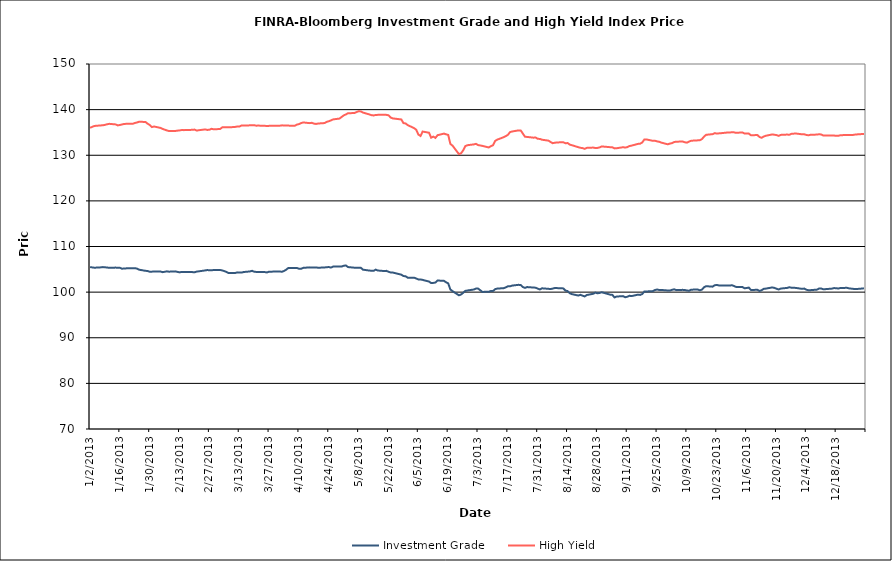
| Category | Investment Grade | High Yield |
|---|---|---|
| 1/2/13 | 105.494 | 136.004 |
| 1/3/13 | 105.419 | 136.223 |
| 1/4/13 | 105.349 | 136.418 |
| 1/7/13 | 105.428 | 136.539 |
| 1/8/13 | 105.485 | 136.567 |
| 1/9/13 | 105.45 | 136.666 |
| 1/10/13 | 105.382 | 136.791 |
| 1/11/13 | 105.347 | 136.887 |
| 1/14/13 | 105.372 | 136.76 |
| 1/15/13 | 105.348 | 136.538 |
| 1/16/13 | 105.332 | 136.64 |
| 1/17/13 | 105.127 | 136.744 |
| 1/18/13 | 105.195 | 136.872 |
| 1/22/13 | 105.239 | 136.901 |
| 1/23/13 | 105.259 | 137.065 |
| 1/24/13 | 105.154 | 137.18 |
| 1/25/13 | 104.918 | 137.344 |
| 1/28/13 | 104.671 | 137.292 |
| 1/29/13 | 104.628 | 136.915 |
| 1/30/13 | 104.462 | 136.633 |
| 1/31/13 | 104.489 | 136.183 |
| 2/1/13 | 104.509 | 136.3 |
| 2/4/13 | 104.516 | 135.996 |
| 2/5/13 | 104.38 | 135.778 |
| 2/6/13 | 104.452 | 135.607 |
| 2/7/13 | 104.557 | 135.447 |
| 2/8/13 | 104.482 | 135.313 |
| 2/11/13 | 104.548 | 135.322 |
| 2/12/13 | 104.435 | 135.393 |
| 2/13/13 | 104.331 | 135.446 |
| 2/14/13 | 104.432 | 135.524 |
| 2/15/13 | 104.394 | 135.504 |
| 2/19/13 | 104.387 | 135.572 |
| 2/20/13 | 104.348 | 135.627 |
| 2/21/13 | 104.499 | 135.402 |
| 2/22/13 | 104.557 | 135.485 |
| 2/25/13 | 104.756 | 135.664 |
| 2/26/13 | 104.841 | 135.55 |
| 2/27/13 | 104.778 | 135.597 |
| 2/28/13 | 104.777 | 135.799 |
| 3/1/13 | 104.858 | 135.684 |
| 3/4/13 | 104.85 | 135.753 |
| 3/5/13 | 104.754 | 136.111 |
| 3/6/13 | 104.599 | 136.122 |
| 3/7/13 | 104.412 | 136.133 |
| 3/8/13 | 104.18 | 136.117 |
| 3/11/13 | 104.184 | 136.2 |
| 3/12/13 | 104.331 | 136.304 |
| 3/13/13 | 104.278 | 136.283 |
| 3/14/13 | 104.276 | 136.504 |
| 3/15/13 | 104.401 | 136.543 |
| 3/18/13 | 104.535 | 136.549 |
| 3/19/13 | 104.67 | 136.561 |
| 3/20/13 | 104.466 | 136.574 |
| 3/21/13 | 104.428 | 136.487 |
| 3/22/13 | 104.404 | 136.502 |
| 3/25/13 | 104.386 | 136.448 |
| 3/26/13 | 104.316 | 136.408 |
| 3/27/13 | 104.488 | 136.442 |
| 3/28/13 | 104.489 | 136.483 |
| 4/1/13 | 104.516 | 136.479 |
| 4/2/13 | 104.463 | 136.55 |
| 4/3/13 | 104.642 | 136.537 |
| 4/4/13 | 104.92 | 136.53 |
| 4/5/13 | 105.293 | 136.496 |
| 4/8/13 | 105.29 | 136.464 |
| 4/9/13 | 105.304 | 136.717 |
| 4/10/13 | 105.125 | 136.822 |
| 4/11/13 | 105.12 | 137.05 |
| 4/12/13 | 105.316 | 137.192 |
| 4/15/13 | 105.424 | 137.038 |
| 4/16/13 | 105.369 | 137.111 |
| 4/17/13 | 105.389 | 136.936 |
| 4/18/13 | 105.407 | 136.862 |
| 4/19/13 | 105.346 | 136.955 |
| 4/22/13 | 105.406 | 137.056 |
| 4/23/13 | 105.46 | 137.317 |
| 4/24/13 | 105.498 | 137.459 |
| 4/25/13 | 105.38 | 137.639 |
| 4/26/13 | 105.595 | 137.856 |
| 4/29/13 | 105.615 | 138.038 |
| 4/30/13 | 105.612 | 138.388 |
| 5/1/13 | 105.781 | 138.733 |
| 5/2/13 | 105.844 | 138.955 |
| 5/3/13 | 105.494 | 139.201 |
| 5/6/13 | 105.353 | 139.261 |
| 5/7/13 | 105.329 | 139.46 |
| 5/8/13 | 105.359 | 139.652 |
| 5/9/13 | 105.342 | 139.604 |
| 5/10/13 | 104.923 | 139.359 |
| 5/13/13 | 104.727 | 138.947 |
| 5/14/13 | 104.694 | 138.789 |
| 5/15/13 | 104.673 | 138.724 |
| 5/16/13 | 104.927 | 138.831 |
| 5/17/13 | 104.738 | 138.852 |
| 5/20/13 | 104.621 | 138.896 |
| 5/21/13 | 104.661 | 138.85 |
| 5/22/13 | 104.462 | 138.759 |
| 5/23/13 | 104.301 | 138.269 |
| 5/24/13 | 104.298 | 138.075 |
| 5/28/13 | 103.825 | 137.844 |
| 5/29/13 | 103.525 | 137.043 |
| 5/30/13 | 103.475 | 136.973 |
| 5/31/13 | 103.159 | 136.601 |
| 6/3/13 | 103.169 | 135.944 |
| 6/4/13 | 102.987 | 135.582 |
| 6/5/13 | 102.781 | 134.538 |
| 6/6/13 | 102.788 | 134.224 |
| 6/7/13 | 102.678 | 135.191 |
| 6/10/13 | 102.314 | 134.939 |
| 6/11/13 | 101.98 | 133.85 |
| 6/12/13 | 102.018 | 134.087 |
| 6/13/13 | 102.11 | 133.805 |
| 6/14/13 | 102.545 | 134.401 |
| 6/17/13 | 102.474 | 134.746 |
| 6/18/13 | 102.164 | 134.589 |
| 6/19/13 | 101.914 | 134.457 |
| 6/20/13 | 100.588 | 132.485 |
| 6/21/13 | 100.219 | 132.116 |
| 6/24/13 | 99.311 | 130.267 |
| 6/25/13 | 99.469 | 130.422 |
| 6/26/13 | 99.857 | 131.058 |
| 6/27/13 | 100.266 | 131.995 |
| 6/28/13 | 100.357 | 132.199 |
| 7/1/13 | 100.575 | 132.38 |
| 7/2/13 | 100.774 | 132.5 |
| 7/3/13 | 100.789 | 132.233 |
| 7/5/13 | 100.052 | 132.062 |
| 7/8/13 | 100.063 | 131.702 |
| 7/9/13 | 100.261 | 131.99 |
| 7/10/13 | 100.23 | 132.194 |
| 7/11/13 | 100.65 | 133.132 |
| 7/12/13 | 100.778 | 133.422 |
| 7/15/13 | 100.866 | 133.956 |
| 7/16/13 | 101.036 | 134.184 |
| 7/17/13 | 101.286 | 134.476 |
| 7/18/13 | 101.274 | 135.077 |
| 7/19/13 | 101.435 | 135.209 |
| 7/22/13 | 101.6 | 135.45 |
| 7/23/13 | 101.546 | 135.437 |
| 7/24/13 | 101.125 | 134.763 |
| 7/25/13 | 100.927 | 134.065 |
| 7/26/13 | 101.109 | 134.013 |
| 7/29/13 | 101.003 | 133.854 |
| 7/30/13 | 100.974 | 133.888 |
| 7/31/13 | 100.761 | 133.596 |
| 8/1/13 | 100.577 | 133.583 |
| 8/2/13 | 100.839 | 133.403 |
| 8/5/13 | 100.724 | 133.206 |
| 8/6/13 | 100.666 | 132.905 |
| 8/7/13 | 100.771 | 132.644 |
| 8/8/13 | 100.906 | 132.743 |
| 8/9/13 | 100.882 | 132.811 |
| 8/12/13 | 100.814 | 132.845 |
| 8/13/13 | 100.327 | 132.628 |
| 8/14/13 | 100.232 | 132.676 |
| 8/15/13 | 99.756 | 132.339 |
| 8/16/13 | 99.565 | 132.204 |
| 8/19/13 | 99.254 | 131.767 |
| 8/20/13 | 99.406 | 131.634 |
| 8/21/13 | 99.234 | 131.571 |
| 8/22/13 | 99.051 | 131.404 |
| 8/23/13 | 99.367 | 131.617 |
| 8/26/13 | 99.636 | 131.681 |
| 8/27/13 | 99.89 | 131.589 |
| 8/28/13 | 99.751 | 131.599 |
| 8/29/13 | 99.819 | 131.721 |
| 8/30/13 | 99.969 | 131.931 |
| 9/3/13 | 99.443 | 131.767 |
| 9/4/13 | 99.4 | 131.735 |
| 9/5/13 | 98.833 | 131.503 |
| 9/6/13 | 99.036 | 131.534 |
| 9/9/13 | 99.126 | 131.762 |
| 9/10/13 | 98.881 | 131.688 |
| 9/11/13 | 98.985 | 131.774 |
| 9/12/13 | 99.199 | 132.012 |
| 9/13/13 | 99.132 | 132.108 |
| 9/16/13 | 99.445 | 132.49 |
| 9/17/13 | 99.387 | 132.526 |
| 9/18/13 | 99.587 | 132.801 |
| 9/19/13 | 100.13 | 133.454 |
| 9/20/13 | 100.145 | 133.463 |
| 9/23/13 | 100.222 | 133.158 |
| 9/24/13 | 100.458 | 133.178 |
| 9/25/13 | 100.57 | 133.037 |
| 9/26/13 | 100.459 | 132.947 |
| 9/27/13 | 100.477 | 132.761 |
| 9/30/13 | 100.36 | 132.403 |
| 10/1/13 | 100.351 | 132.559 |
| 10/2/13 | 100.5 | 132.65 |
| 10/3/13 | 100.614 | 132.895 |
| 10/4/13 | 100.436 | 132.974 |
| 10/7/13 | 100.499 | 133.004 |
| 10/8/13 | 100.458 | 132.84 |
| 10/9/13 | 100.359 | 132.765 |
| 10/10/13 | 100.309 | 133.012 |
| 10/11/13 | 100.536 | 133.183 |
| 10/14/13 | 100.578 | 133.263 |
| 10/15/13 | 100.404 | 133.285 |
| 10/16/13 | 100.541 | 133.539 |
| 10/17/13 | 101.066 | 134.085 |
| 10/18/13 | 101.3 | 134.484 |
| 10/21/13 | 101.202 | 134.622 |
| 10/22/13 | 101.507 | 134.843 |
| 10/23/13 | 101.575 | 134.752 |
| 10/24/13 | 101.454 | 134.8 |
| 10/25/13 | 101.475 | 134.836 |
| 10/28/13 | 101.432 | 134.984 |
| 10/29/13 | 101.425 | 134.988 |
| 10/30/13 | 101.524 | 135.037 |
| 10/31/13 | 101.352 | 135.022 |
| 11/1/13 | 101.143 | 134.905 |
| 11/4/13 | 101.125 | 135.008 |
| 11/5/13 | 100.846 | 134.753 |
| 11/6/13 | 100.906 | 134.761 |
| 11/7/13 | 100.99 | 134.746 |
| 11/8/13 | 100.473 | 134.373 |
| 11/11/13 | 100.506 | 134.437 |
| 11/12/13 | 100.257 | 134.002 |
| 11/13/13 | 100.423 | 133.829 |
| 11/14/13 | 100.717 | 134.11 |
| 11/15/13 | 100.772 | 134.271 |
| 11/18/13 | 101.031 | 134.561 |
| 11/19/13 | 100.928 | 134.495 |
| 11/20/13 | 100.749 | 134.418 |
| 11/21/13 | 100.578 | 134.251 |
| 11/22/13 | 100.784 | 134.462 |
| 11/25/13 | 100.926 | 134.532 |
| 11/26/13 | 101.066 | 134.489 |
| 11/27/13 | 100.968 | 134.694 |
| 11/29/13 | 100.926 | 134.769 |
| 12/2/13 | 100.715 | 134.59 |
| 12/3/13 | 100.783 | 134.592 |
| 12/4/13 | 100.522 | 134.448 |
| 12/5/13 | 100.422 | 134.378 |
| 12/6/13 | 100.434 | 134.486 |
| 12/9/13 | 100.55 | 134.531 |
| 12/10/13 | 100.804 | 134.606 |
| 12/11/13 | 100.783 | 134.549 |
| 12/12/13 | 100.616 | 134.316 |
| 12/13/13 | 100.656 | 134.34 |
| 12/16/13 | 100.77 | 134.355 |
| 12/17/13 | 100.883 | 134.318 |
| 12/18/13 | 100.862 | 134.256 |
| 12/19/13 | 100.784 | 134.28 |
| 12/20/13 | 100.91 | 134.382 |
| 12/23/13 | 100.94 | 134.459 |
| 12/24/13 | 100.826 | 134.433 |
| 12/26/13 | 100.715 | 134.462 |
| 12/27/13 | 100.661 | 134.544 |
| 12/30/13 | 100.78 | 134.644 |
| 12/31/13 | 100.835 | 134.665 |